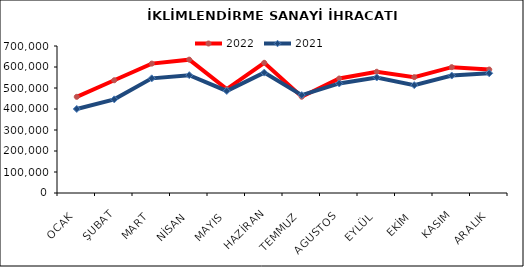
| Category | 2022 | 2021 |
|---|---|---|
| OCAK | 457936.191 | 400023.77 |
| ŞUBAT | 536901.765 | 445925.118 |
| MART | 616171.143 | 545985.294 |
| NİSAN | 635006.784 | 561086.218 |
| MAYIS | 494775.119 | 485871.661 |
| HAZİRAN | 620022.014 | 573154.107 |
| TEMMUZ | 458475.499 | 466206.553 |
| AGUSTOS | 545193.89 | 521625.022 |
| EYLÜL | 577358.884 | 550044.718 |
| EKİM | 551554.405 | 513411.636 |
| KASIM | 599153.041 | 559243.973 |
| ARALIK | 587981.145 | 570142.197 |